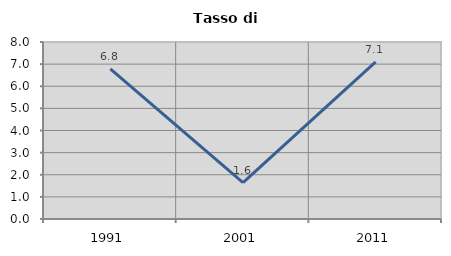
| Category | Tasso di disoccupazione   |
|---|---|
| 1991.0 | 6.79 |
| 2001.0 | 1.639 |
| 2011.0 | 7.104 |